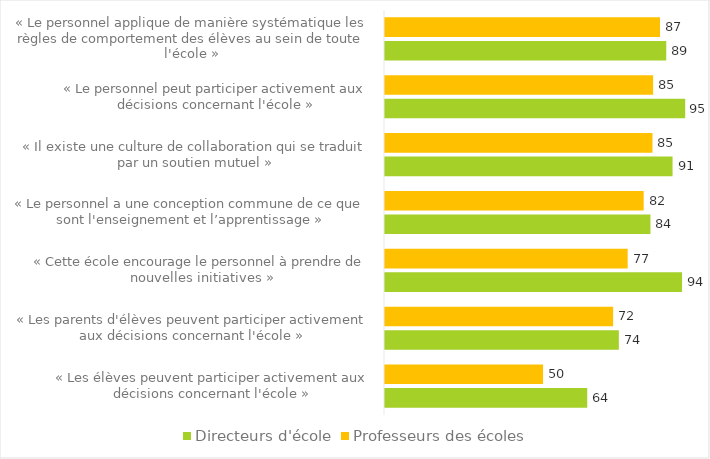
| Category | Directeurs d'école | Professeurs des écoles |
|---|---|---|
| « Les élèves peuvent participer activement aux décisions concernant l'école » | 0.64 | 0.5 |
| « Les parents d'élèves peuvent participer activement aux décisions concernant l'école » | 0.74 | 0.722 |
| « Cette école encourage le personnel à prendre de nouvelles initiatives » | 0.94 | 0.768 |
| « Le personnel a une conception commune de ce que sont l'enseignement et l’apprentissage » | 0.84 | 0.819 |
| « Il existe une culture de collaboration qui se traduit par un soutien mutuel » | 0.91 | 0.846 |
| « Le personnel peut participer activement aux décisions concernant l'école » | 0.95 | 0.848 |
| « Le personnel applique de manière systématique les règles de comportement des élèves au sein de toute l'école »  | 0.89 | 0.87 |